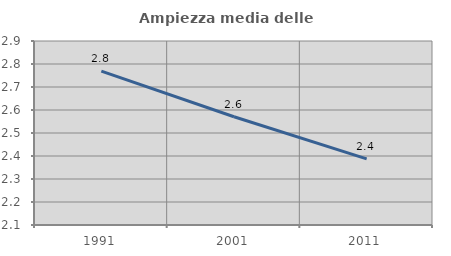
| Category | Ampiezza media delle famiglie |
|---|---|
| 1991.0 | 2.769 |
| 2001.0 | 2.571 |
| 2011.0 | 2.388 |